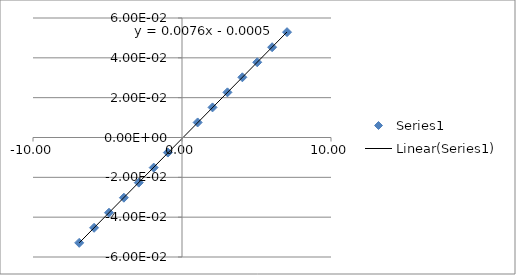
| Category | Series 0 |
|---|---|
| -6.9 | -0.053 |
| -5.9 | -0.045 |
| -4.9 | -0.038 |
| -3.9 | -0.03 |
| -2.9 | -0.023 |
| -1.9 | -0.015 |
| -0.95 | -0.008 |
| 1.05 | 0.008 |
| 2.05 | 0.015 |
| 3.05 | 0.023 |
| 4.05 | 0.03 |
| 5.05 | 0.038 |
| 6.05 | 0.045 |
| 7.05 | 0.053 |